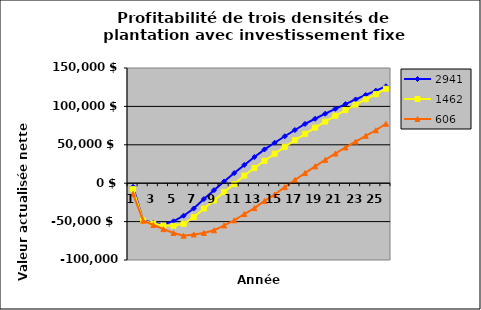
| Category | 2941 | 1462 | 606 |
|---|---|---|---|
| 0 | -4755.25 | -7788.318 | -13994.409 |
| 1 | -48597.062 | -48770.534 | -48883.548 |
| 2 | -51379.658 | -52589.169 | -54410.886 |
| 3 | -53380.634 | -55017.957 | -59887.529 |
| 4 | -49613.022 | -55454.336 | -64883.89 |
| 5 | -42308.613 | -52902.029 | -68405.605 |
| 6 | -32938.625 | -44120.16 | -66722.489 |
| 7 | -20673.126 | -32999.785 | -64808.613 |
| 8 | -9024.215 | -22524.464 | -61378.784 |
| 9 | 2263.489 | -11510.293 | -54965.012 |
| 10 | 13201.187 | -1171.732 | -48372.215 |
| 11 | 23799.731 | 9966.438 | -40136.494 |
| 12 | 34069.638 | 19746.574 | -32409.972 |
| 13 | 44021.099 | 29223.45 | -23116.976 |
| 14 | 52695.747 | 38406.47 | -14732.453 |
| 15 | 61101.414 | 47304.745 | -5130.78 |
| 16 | 69246.44 | 55927.104 | 4173.168 |
| 17 | 77138.906 | 64282.103 | 13188.621 |
| 18 | 83933.026 | 72378.033 | 21924.525 |
| 19 | 90516.476 | 80222.926 | 30389.548 |
| 20 | 96895.787 | 87824.566 | 38592.09 |
| 21 | 103077.291 | 95190.497 | 46540.289 |
| 22 | 109067.12 | 102328.027 | 54242.033 |
| 23 | 114871.217 | 109244.238 | 61704.963 |
| 24 | 120495.343 | 115945.993 | 68936.484 |
| 25 | 126177.858 | 123036.656 | 77373.379 |